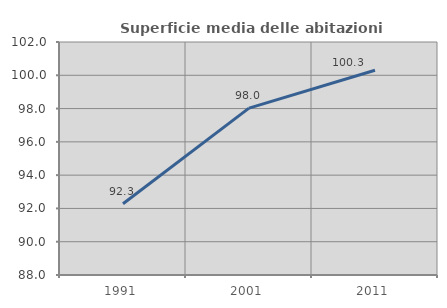
| Category | Superficie media delle abitazioni occupate |
|---|---|
| 1991.0 | 92.282 |
| 2001.0 | 98.028 |
| 2011.0 | 100.3 |